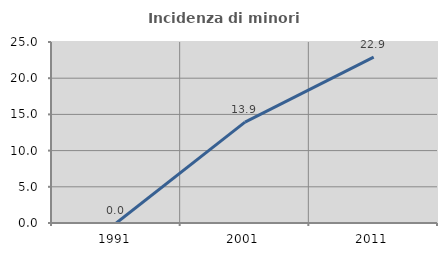
| Category | Incidenza di minori stranieri |
|---|---|
| 1991.0 | 0 |
| 2001.0 | 13.924 |
| 2011.0 | 22.917 |